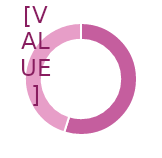
| Category | Series 0 |
|---|---|
| 0 | 0.549 |
| 1 | 0.451 |